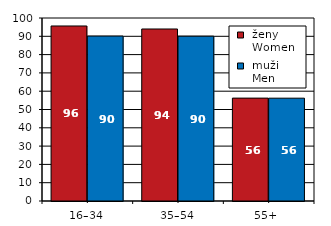
| Category |  ženy 
 Women |  muži 
 Men |
|---|---|---|
| 16–34 | 95.643 | 90.143 |
| 35–54 | 93.992 | 90.092 |
| 55+  | 56.216 | 56.19 |